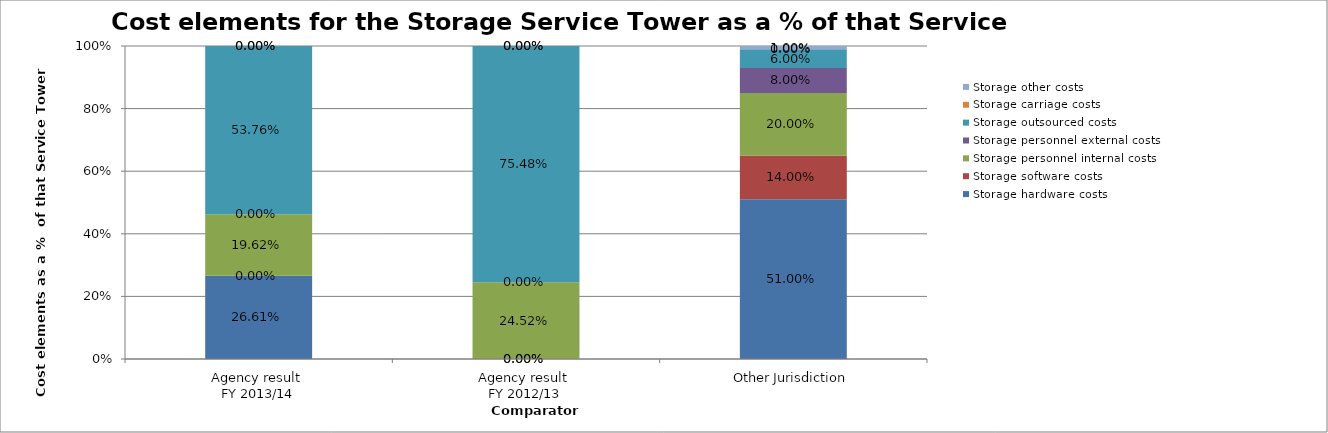
| Category | Storage hardware costs | Storage software costs | Storage personnel internal costs | Storage personnel external costs | Storage outsourced costs | Storage carriage costs | Storage other costs |
|---|---|---|---|---|---|---|---|
| Agency result 
FY 2013/14 | 0.266 | 0 | 0.196 | 0 | 0.538 | 0 | 0 |
| Agency result 
FY 2012/13 | 0 | 0 | 0.245 | 0 | 0.755 | 0 | 0 |
| Other Jurisdiction | 0.51 | 0.14 | 0.2 | 0.08 | 0.06 | 0 | 0.01 |